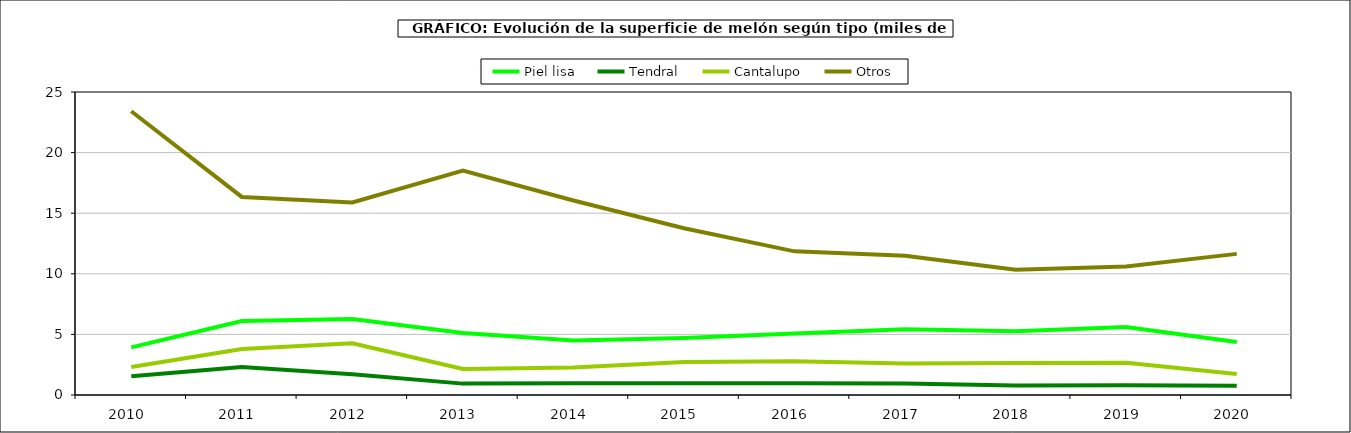
| Category | Piel lisa | Tendral | Cantalupo | Otros |
|---|---|---|---|---|
| 2010.0 | 3.925 | 1.546 | 2.308 | 23.409 |
| 2011.0 | 6.109 | 2.318 | 3.791 | 16.343 |
| 2012.0 | 6.265 | 1.708 | 4.27 | 15.887 |
| 2013.0 | 5.109 | 0.939 | 2.152 | 18.523 |
| 2014.0 | 4.503 | 0.973 | 2.277 | 16.047 |
| 2015.0 | 4.698 | 0.96 | 2.723 | 13.763 |
| 2016.0 | 5.074 | 0.966 | 2.793 | 11.853 |
| 2017.0 | 5.417 | 0.953 | 2.608 | 11.495 |
| 2018.0 | 5.27 | 0.78 | 2.648 | 10.327 |
| 2019.0 | 5.608 | 0.803 | 2.669 | 10.611 |
| 2020.0 | 4.38 | 0.765 | 1.727 | 11.645 |